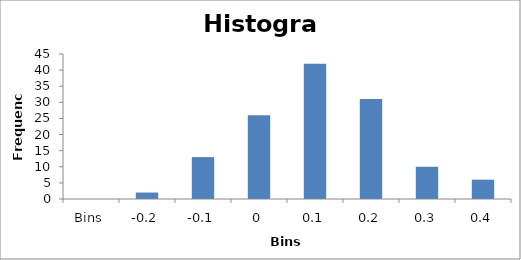
| Category | Series 0 |
|---|---|
| Bins | 0 |
| -0.2 | 2 |
| -0.1 | 13 |
| 0 | 26 |
| 0.1 | 42 |
| 0.2 | 31 |
| 0.3 | 10 |
| 0.4 | 6 |